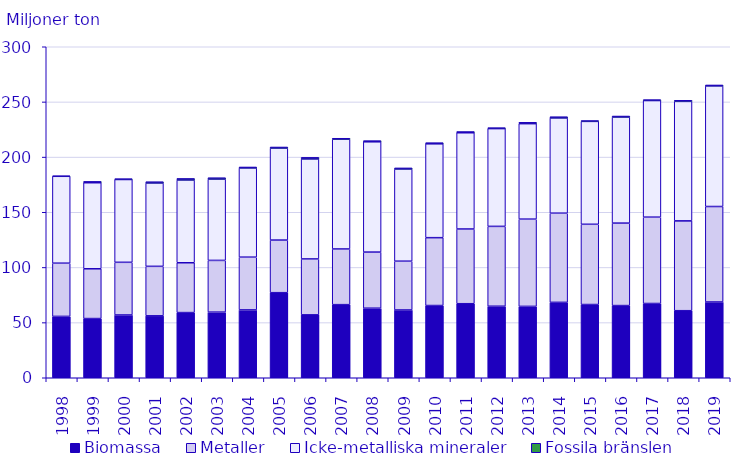
| Category | Biomassa | Metaller | Icke-metalliska mineraler | Fossila bränslen |
|---|---|---|---|---|
| 1998.0 | 55.605 | 48.234 | 78.756 | 0.319 |
| 1999.0 | 53.658 | 45.113 | 77.989 | 1.234 |
| 2000.0 | 56.896 | 47.732 | 75.055 | 0.712 |
| 2001.0 | 56.119 | 44.862 | 75.561 | 1.169 |
| 2002.0 | 59.06 | 45.156 | 75.047 | 1.406 |
| 2003.0 | 59.466 | 46.889 | 73.732 | 1.243 |
| 2004.0 | 61.477 | 47.83 | 80.845 | 0.894 |
| 2005.0 | 77.099 | 47.687 | 83.378 | 1 |
| 2006.0 | 57.006 | 50.691 | 90.646 | 1.427 |
| 2007.0 | 66.256 | 50.466 | 99.471 | 0.878 |
| 2008.0 | 63.046 | 50.844 | 99.977 | 1.071 |
| 2009.0 | 61.433 | 44.222 | 83.551 | 1.002 |
| 2010.0 | 65.456 | 61.516 | 85.067 | 1.039 |
| 2011.0 | 67.104 | 67.717 | 87.229 | 1.125 |
| 2012.0 | 64.829 | 72.374 | 88.61 | 0.847 |
| 2013.0 | 64.676 | 79.086 | 86.528 | 1.255 |
| 2014.0 | 68.341 | 80.836 | 86.326 | 1.112 |
| 2015.0 | 66.374 | 72.734 | 93.26 | 0.718 |
| 2016.0 | 65.427 | 74.733 | 96.141 | 0.925 |
| 2017.0 | 67.3 | 78.264 | 105.679 | 0.825 |
| 2018.0 | 60.769 | 81.424 | 108.271 | 1.04 |
| 2019.0 | 68.657 | 86.554 | 109.302 | 0.863 |